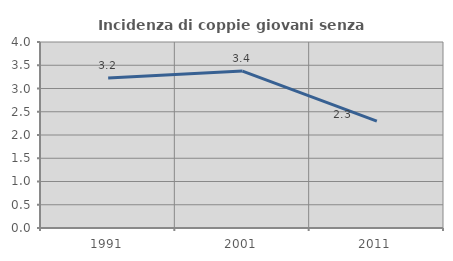
| Category | Incidenza di coppie giovani senza figli |
|---|---|
| 1991.0 | 3.226 |
| 2001.0 | 3.375 |
| 2011.0 | 2.299 |